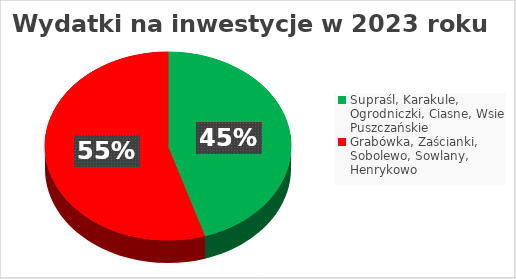
| Category | Series 0 |
|---|---|
| Supraśl, Karakule, Ogrodniczki, Ciasne, Wsie Puszczańskie | 16404311.35 |
| Grabówka, Zaścianki, Sobolewo, Sowlany, Henrykowo | 19931955.29 |